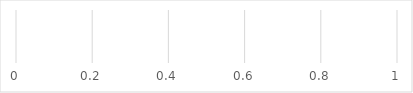
| Category | C | G | LG | LA | A | LR | R | NA |
|---|---|---|---|---|---|---|---|---|
| Business Readiness | 0 | 0 | 0 | 0 | 0 | 0 | 0 | 0 |